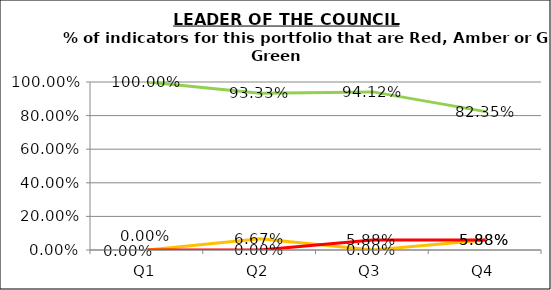
| Category | Green | Amber | Red |
|---|---|---|---|
| Q1 | 1 | 0 | 0 |
| Q2 | 0.933 | 0.067 | 0 |
| Q3 | 0.941 | 0 | 0.059 |
| Q4 | 0.824 | 0.059 | 0.059 |